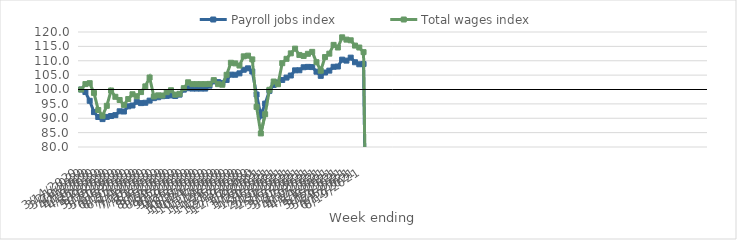
| Category | Payroll jobs index | Total wages index |
|---|---|---|
| 14/03/2020 | 100 | 100 |
| 21/03/2020 | 99.119 | 101.886 |
| 28/03/2020 | 96.073 | 102.196 |
| 04/04/2020 | 92.144 | 98.816 |
| 11/04/2020 | 90.438 | 92.865 |
| 18/04/2020 | 89.702 | 90.851 |
| 25/04/2020 | 90.463 | 94.323 |
| 02/05/2020 | 90.777 | 99.653 |
| 09/05/2020 | 91.084 | 97.462 |
| 16/05/2020 | 92.419 | 96.35 |
| 23/05/2020 | 92.342 | 94.643 |
| 30/05/2020 | 94.145 | 96.674 |
| 06/06/2020 | 94.433 | 98.349 |
| 13/06/2020 | 95.725 | 97.652 |
| 20/06/2020 | 95.262 | 99.101 |
| 27/06/2020 | 95.388 | 101.089 |
| 04/07/2020 | 96.132 | 104.17 |
| 11/07/2020 | 96.99 | 97.58 |
| 18/07/2020 | 97.313 | 97.966 |
| 25/07/2020 | 97.673 | 97.91 |
| 01/08/2020 | 97.768 | 99.059 |
| 08/08/2020 | 97.932 | 99.737 |
| 15/08/2020 | 97.734 | 98.202 |
| 22/08/2020 | 98.222 | 98.504 |
| 29/08/2020 | 99.948 | 100.463 |
| 05/09/2020 | 100.439 | 102.501 |
| 12/09/2020 | 100.326 | 101.868 |
| 19/09/2020 | 100.326 | 101.868 |
| 26/09/2020 | 100.326 | 101.868 |
| 03/10/2020 | 100.326 | 101.868 |
| 10/10/2020 | 101.338 | 101.941 |
| 17/10/2020 | 102.819 | 103.262 |
| 24/10/2020 | 102.568 | 101.857 |
| 31/10/2020 | 102.287 | 101.658 |
| 07/11/2020 | 103.318 | 105.114 |
| 14/11/2020 | 105.168 | 109.294 |
| 21/11/2020 | 105.127 | 109.081 |
| 28/11/2020 | 105.619 | 108.333 |
| 05/12/2020 | 106.861 | 111.536 |
| 12/12/2020 | 107.36 | 111.772 |
| 19/12/2020 | 106.248 | 110.469 |
| 26/12/2020 | 98.245 | 93.95 |
| 02/01/2021 | 90.952 | 84.722 |
| 09/01/2021 | 95.089 | 91.39 |
| 16/01/2021 | 99.53 | 99.894 |
| 23/01/2021 | 101.602 | 102.77 |
| 30/01/2021 | 102.429 | 101.839 |
| 06/02/2021 | 103.317 | 109.157 |
| 13/02/2021 | 104.145 | 110.673 |
| 20/02/2021 | 104.866 | 112.569 |
| 27/02/2021 | 106.659 | 114.216 |
| 06/03/2021 | 106.686 | 112.02 |
| 13/03/2021 | 107.734 | 111.671 |
| 20/03/2021 | 107.875 | 112.413 |
| 27/03/2021 | 107.796 | 113.089 |
| 03/04/2021 | 106.196 | 109.498 |
| 10/04/2021 | 104.75 | 106.535 |
| 17/04/2021 | 105.91 | 111.287 |
| 24/04/2021 | 106.56 | 112.465 |
| 01/05/2021 | 107.896 | 115.52 |
| 08/05/2021 | 107.991 | 114.607 |
| 15/05/2021 | 110.386 | 118.146 |
| 22/05/2021 | 110.046 | 117.35 |
| 29/05/2021 | 111.084 | 117.115 |
| 05/06/2021 | 109.475 | 115.273 |
| 12/06/2021 | 108.775 | 114.598 |
| 19/06/2021 | 108.867 | 112.992 |